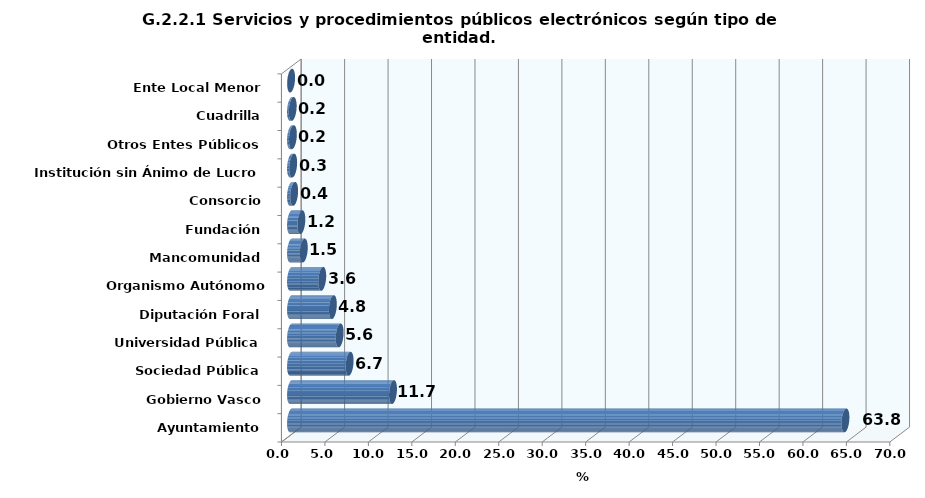
| Category | 2016 |
|---|---|
| Ayuntamiento | 63.795 |
| Gobierno Vasco | 11.736 |
| Sociedad Pública | 6.745 |
| Universidad Pública | 5.6 |
| Diputación Foral | 4.817 |
| Organismo Autónomo Administrativo | 3.593 |
| Mancomunidad | 1.473 |
| Fundación | 1.194 |
| Consorcio | 0.363 |
| Institución sin Ánimo de Lucro | 0.252 |
| Otros Entes Públicos | 0.219 |
| Cuadrilla | 0.198 |
| Ente Local Menor | 0.015 |